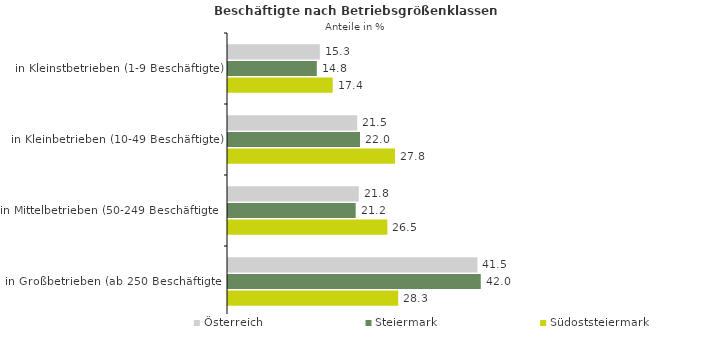
| Category | Österreich | Steiermark | Südoststeiermark |
|---|---|---|---|
| in Kleinstbetrieben (1-9 Beschäftigte) | 15.273 | 14.768 | 17.412 |
| in Kleinbetrieben (10-49 Beschäftigte) | 21.487 | 21.955 | 27.772 |
| in Mittelbetrieben (50-249 Beschäftigte) | 21.75 | 21.237 | 26.506 |
| in Großbetrieben (ab 250 Beschäftigte) | 41.489 | 42.04 | 28.31 |